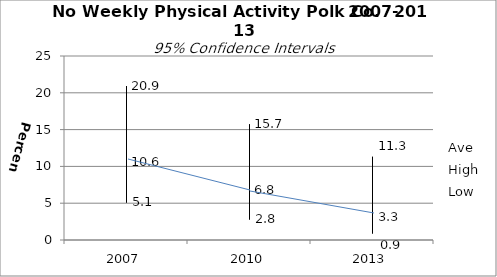
| Category | Ave | High | Low |
|---|---|---|---|
| 2007.0 | 10.6 | 20.9 | 5.1 |
| 2010.0 | 6.8 | 15.7 | 2.8 |
| 2013.0 | 3.3 | 11.3 | 0.9 |